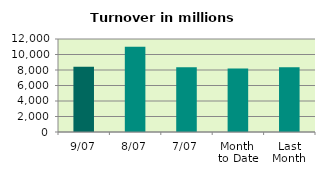
| Category | Series 0 |
|---|---|
| 9/07 | 8409.387 |
| 8/07 | 11015.769 |
| 7/07 | 8370.104 |
| Month 
to Date | 8190.998 |
| Last
Month | 8344.334 |